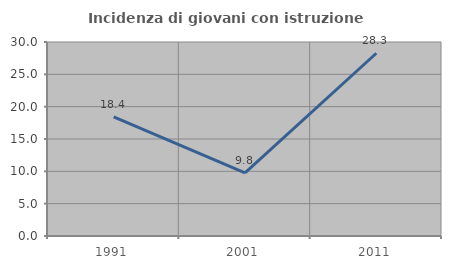
| Category | Incidenza di giovani con istruzione universitaria |
|---|---|
| 1991.0 | 18.421 |
| 2001.0 | 9.756 |
| 2011.0 | 28.261 |